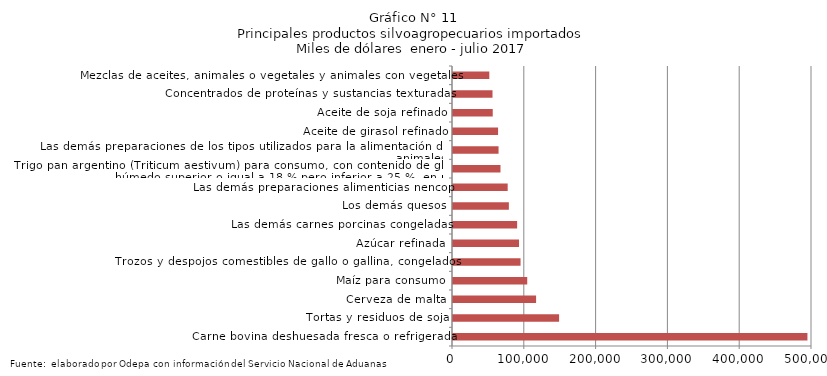
| Category | Series 0 |
|---|---|
| Carne bovina deshuesada fresca o refrigerada | 493646.038 |
| Tortas y residuos de soja | 147752.238 |
| Cerveza de malta | 115724.612 |
| Maíz para consumo | 103380.024 |
| Trozos y despojos comestibles de gallo o gallina, congelados | 94080.557 |
| Azúcar refinada | 91961.107 |
| Las demás carnes porcinas congeladas | 89311.156 |
| Los demás quesos | 77811.159 |
| Las demás preparaciones alimenticias nencop | 76153.997 |
| Trigo pan argentino (Triticum aestivum) para consumo, con contenido de gluten húmedo superior o igual a 18 % pero inferior a 25 %, en peso | 66133.485 |
| Las demás preparaciones de los tipos utilizados para la alimentación de los animales | 63447.962 |
| Aceite de girasol refinado | 62781.694 |
| Aceite de soja refinado | 55354.931 |
| Concentrados de proteínas y sustancias texturadas | 55005.777 |
| Mezclas de aceites, animales o vegetales y animales con vegetales | 50575.468 |